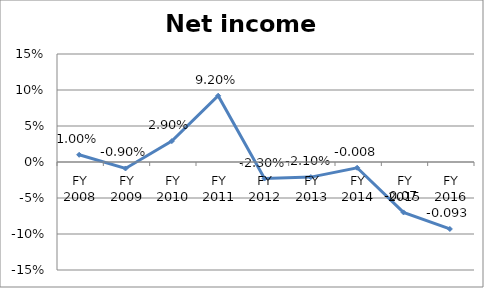
| Category | Net income ratio |
|---|---|
| FY 2016 | -0.093 |
| FY 2015 | -0.07 |
| FY 2014 | -0.008 |
| FY 2013 | -0.021 |
| FY 2012 | -0.023 |
| FY 2011 | 0.092 |
| FY 2010 | 0.029 |
| FY 2009 | -0.009 |
| FY 2008 | 0.01 |